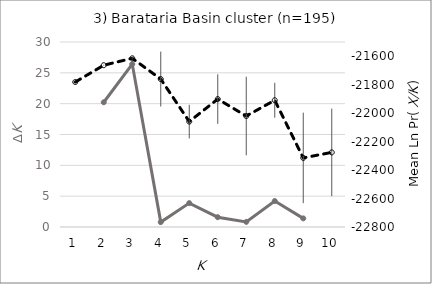
| Category | Evanno's ΔK |
|---|---|
| 0 | 0 |
| 1 | 20.227 |
| 2 | 26.416 |
| 3 | 0.792 |
| 4 | 3.872 |
| 5 | 1.591 |
| 6 | 0.832 |
| 7 | 4.206 |
| 8 | 1.396 |
| 9 | 0 |